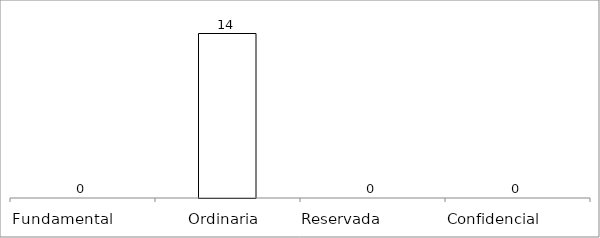
| Category | Series 0 |
|---|---|
| Fundamental         | 0 |
| Ordinaria  | 14 |
| Reservada               | 0 |
| Confidencial             | 0 |